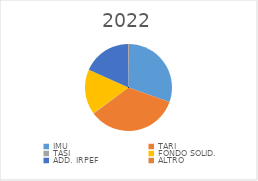
| Category | Series 0 |
|---|---|
| IMU | 2150000 |
| TARI | 2430612 |
| TASI | 10000 |
| FONDO SOLID. | 1186000 |
| ADD. IRPEF | 1280000 |
| ALTRO | 11750 |